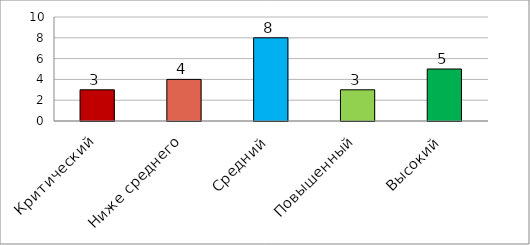
| Category | Series 0 |
|---|---|
| Критический | 3 |
| Ниже среднего | 4 |
| Средний | 8 |
| Повышенный | 3 |
| Высокий | 5 |